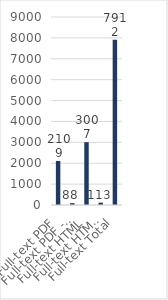
| Category | Series 0 |
|---|---|
| Full-text PDF | 2109 |
| Full-text PDF - mobile format | 88 |
| Full-text HTML | 3007 |
| Full-text HTML - mobile format | 113 |
| Full-text Total | 7912 |